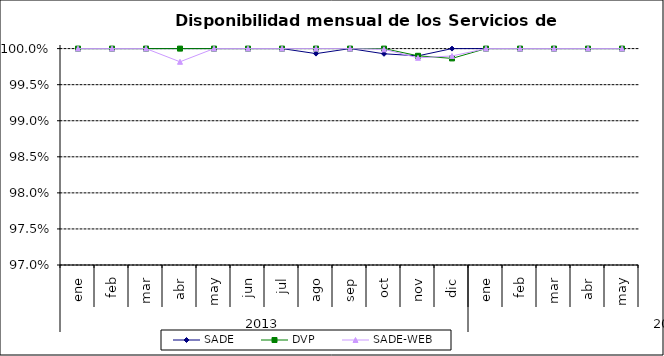
| Category | SADE | DVP | SADE-WEB |
|---|---|---|---|
| 0 | 1 | 1 | 1 |
| 1 | 1 | 1 | 1 |
| 2 | 1 | 1 | 1 |
| 3 | 1 | 1 | 0.998 |
| 4 | 1 | 1 | 1 |
| 5 | 1 | 1 | 1 |
| 6 | 1 | 1 | 1 |
| 7 | 0.999 | 1 | 1 |
| 8 | 1 | 1 | 1 |
| 9 | 0.999 | 1 | 1 |
| 10 | 0.999 | 0.999 | 0.999 |
| 11 | 1 | 0.999 | 0.999 |
| 12 | 1 | 1 | 1 |
| 13 | 1 | 1 | 1 |
| 14 | 1 | 1 | 1 |
| 15 | 1 | 1 | 1 |
| 16 | 1 | 1 | 1 |